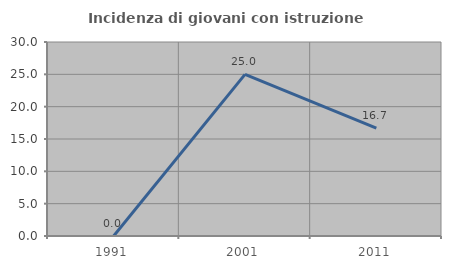
| Category | Incidenza di giovani con istruzione universitaria |
|---|---|
| 1991.0 | 0 |
| 2001.0 | 25 |
| 2011.0 | 16.667 |